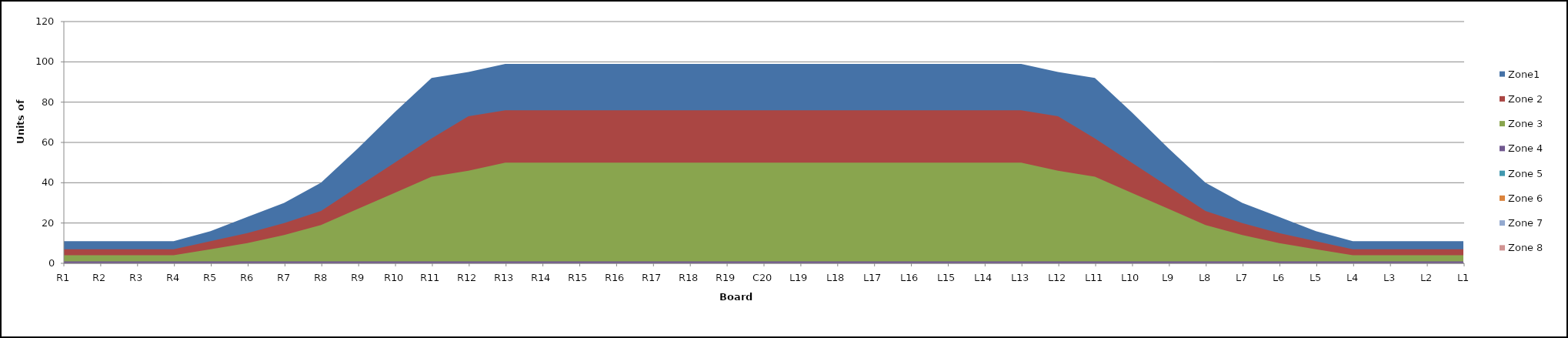
| Category | Zone1 | Zone 2 | Zone 3 | Zone 4 | Zone 5 | Zone 6 | Zone 7 | Zone 8 |
|---|---|---|---|---|---|---|---|---|
| L1 | 11 | 7 | 4 | 1 |  |  |  |  |
| L2 | 11 | 7 | 4 | 1 |  |  |  |  |
| L3 | 11 | 7 | 4 | 1 |  |  |  |  |
| L4 | 11 | 7 | 4 | 1 |  |  |  |  |
| L5 | 16 | 11 | 7 | 1 |  |  |  |  |
| L6 | 23 | 15 | 10 | 1 |  |  |  |  |
| L7 | 30 | 20 | 14 | 1 |  |  |  |  |
| L8 | 40 | 26 | 19 | 1 |  |  |  |  |
| L9 | 57 | 38 | 27 | 1 |  |  |  |  |
| L10 | 75 | 50 | 35 | 1 |  |  |  |  |
| L11 | 92 | 62 | 43 | 1 |  |  |  |  |
| L12 | 95 | 73 | 46 | 1 |  |  |  |  |
| L13 | 99 | 76 | 50 | 1 |  |  |  |  |
| L14 | 99 | 76 | 50 | 1 |  |  |  |  |
| L15 | 99 | 76 | 50 | 1 |  |  |  |  |
| L16 | 99 | 76 | 50 | 1 |  |  |  |  |
| L17 | 99 | 76 | 50 | 1 |  |  |  |  |
| L18 | 99 | 76 | 50 | 1 |  |  |  |  |
| L19 | 99 | 76 | 50 | 1 |  |  |  |  |
| C20 | 99 | 76 | 50 | 1 |  |  |  |  |
| R19 | 99 | 76 | 50 | 1 |  |  |  |  |
| R18 | 99 | 76 | 50 | 1 |  |  |  |  |
| R17 | 99 | 76 | 50 | 1 |  |  |  |  |
| R16 | 99 | 76 | 50 | 1 |  |  |  |  |
| R15 | 99 | 76 | 50 | 1 |  |  |  |  |
| R14 | 99 | 76 | 50 | 1 |  |  |  |  |
| R13 | 99 | 76 | 50 | 1 |  |  |  |  |
| R12 | 95 | 73 | 46 | 1 |  |  |  |  |
| R11 | 92 | 62 | 43 | 1 |  |  |  |  |
| R10 | 75 | 50 | 35 | 1 |  |  |  |  |
| R9 | 57 | 38 | 27 | 1 |  |  |  |  |
| R8 | 40 | 26 | 19 | 1 |  |  |  |  |
| R7 | 30 | 20 | 14 | 1 |  |  |  |  |
| R6 | 23 | 15 | 10 | 1 |  |  |  |  |
| R5 | 16 | 11 | 7 | 1 |  |  |  |  |
| R4 | 11 | 7 | 4 | 1 |  |  |  |  |
| R3 | 11 | 7 | 4 | 1 |  |  |  |  |
| R2 | 11 | 7 | 4 | 1 |  |  |  |  |
| R1 | 11 | 7 | 4 | 1 |  |  |  |  |